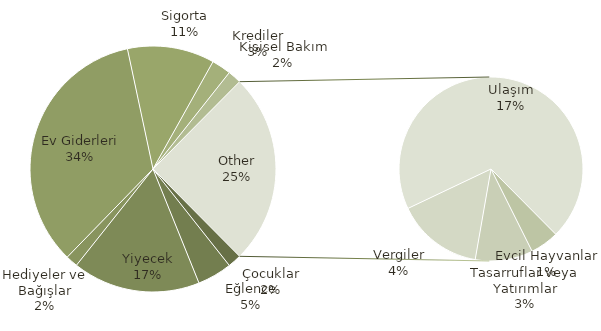
| Category | Toplam |
|---|---|
| Çocuklar | 140 |
| Eğlence | 358 |
| Yiyecek | 1320 |
| Hediyeler ve Bağışlar | 125 |
| Ev Giderleri | 2702 |
| Sigorta | 900 |
| Krediler | 200 |
| Kişisel Bakım | 140 |
| Evcil Hayvanlar | 100 |
| Tasarruflar veya Yatırımlar | 200 |
| Vergiler | 300 |
| Ulaşım | 1375 |